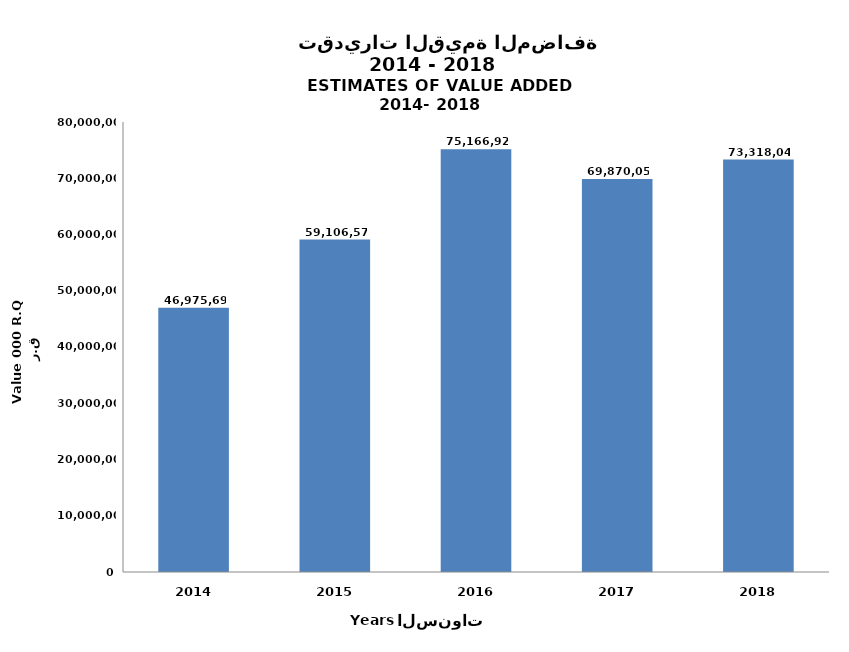
| Category | السنة
Year |
|---|---|
| 2018.0 | 73318042 |
| 2017.0 | 69870056 |
| 2016.0 | 75166929 |
| 2015.0 | 59106571 |
| 2014.0 | 46975693 |